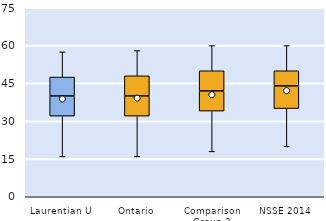
| Category | 25th | 50th | 75th |
|---|---|---|---|
| Laurentian U | 32 | 8 | 7.5 |
| Ontario | 32 | 8 | 8 |
| Comparison Group 2 | 34 | 8 | 8 |
| NSSE 2014 | 35 | 9 | 6 |